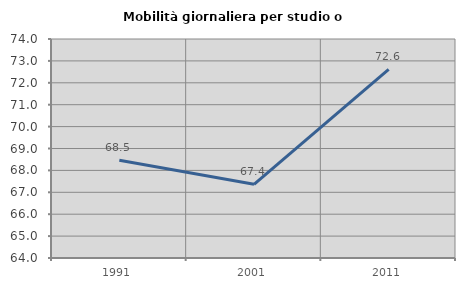
| Category | Mobilità giornaliera per studio o lavoro |
|---|---|
| 1991.0 | 68.465 |
| 2001.0 | 67.366 |
| 2011.0 | 72.618 |